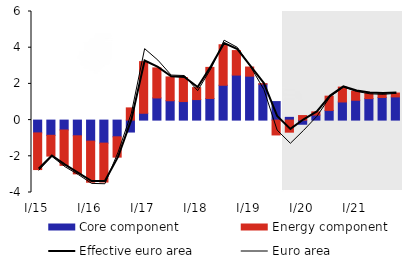
| Category | Core component | Energy component |
|---|---|---|
| I/15 | -0.708 | -2.025 |
| II | -0.84 | -1.149 |
| III | -0.548 | -1.954 |
| IV | -0.866 | -2.104 |
| I/16 | -1.162 | -2.271 |
| II | -1.273 | -2.15 |
| III | -0.923 | -1.123 |
| IV | -0.66 | 0.675 |
| I/17 | 0.378 | 2.853 |
| II | 1.224 | 1.66 |
| III | 1.07 | 1.316 |
| IV | 1.025 | 1.321 |
| I/18 | 1.134 | 0.662 |
| II | 1.196 | 1.716 |
| III | 1.925 | 2.238 |
| IV | 2.487 | 1.354 |
| I/19 | 2.428 | 0.504 |
| II | 1.988 | 0.024 |
| III | 1.023 | -0.82 |
| IV | 0.152 | -0.667 |
| I/20 | -0.23 | 0.251 |
| II | 0.278 | 0.177 |
| III | 0.536 | 0.787 |
| IV | 1.002 | 0.821 |
| I/21 | 1.096 | 0.501 |
| II | 1.187 | 0.303 |
| III | 1.252 | 0.213 |
| IV | 1.282 | 0.211 |